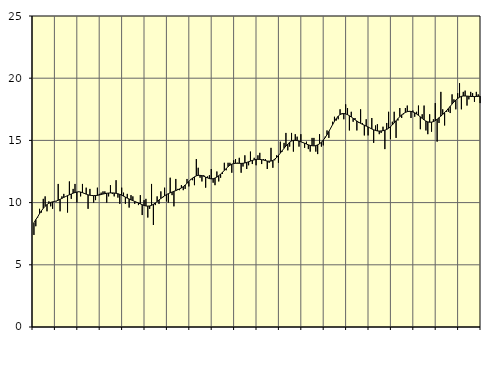
| Category | Piggar | Series 1 |
|---|---|---|
| nan | 7.4 | 8.38 |
| 1.0 | 8.1 | 8.63 |
| 1.0 | 8.8 | 8.85 |
| 1.0 | 9.5 | 9.11 |
| 1.0 | 9.2 | 9.34 |
| 1.0 | 10.3 | 9.54 |
| 1.0 | 10.5 | 9.71 |
| 1.0 | 9.3 | 9.84 |
| 1.0 | 10.1 | 9.95 |
| 1.0 | 9.7 | 10.02 |
| 1.0 | 9.5 | 10.06 |
| 1.0 | 10.1 | 10.09 |
| nan | 10.1 | 10.13 |
| 2.0 | 11.5 | 10.19 |
| 2.0 | 9.3 | 10.26 |
| 2.0 | 10.5 | 10.34 |
| 2.0 | 10.7 | 10.42 |
| 2.0 | 10.5 | 10.49 |
| 2.0 | 9.2 | 10.56 |
| 2.0 | 11.7 | 10.63 |
| 2.0 | 10.3 | 10.69 |
| 2.0 | 11.1 | 10.76 |
| 2.0 | 11.5 | 10.81 |
| 2.0 | 10 | 10.85 |
| nan | 10.9 | 10.87 |
| 3.0 | 10.5 | 10.85 |
| 3.0 | 11.5 | 10.8 |
| 3.0 | 10.7 | 10.74 |
| 3.0 | 11.2 | 10.68 |
| 3.0 | 9.5 | 10.62 |
| 3.0 | 11.1 | 10.59 |
| 3.0 | 10.6 | 10.57 |
| 3.0 | 10 | 10.56 |
| 3.0 | 10.2 | 10.57 |
| 3.0 | 11.2 | 10.58 |
| 3.0 | 10.7 | 10.61 |
| nan | 10.8 | 10.65 |
| 4.0 | 10.9 | 10.69 |
| 4.0 | 10.9 | 10.72 |
| 4.0 | 10 | 10.75 |
| 4.0 | 10.5 | 10.77 |
| 4.0 | 11.4 | 10.78 |
| 4.0 | 10.7 | 10.78 |
| 4.0 | 10.5 | 10.77 |
| 4.0 | 11.8 | 10.75 |
| 4.0 | 10.4 | 10.71 |
| 4.0 | 9.9 | 10.66 |
| 4.0 | 11.2 | 10.6 |
| nan | 10.8 | 10.52 |
| 5.0 | 9.9 | 10.44 |
| 5.0 | 10.7 | 10.36 |
| 5.0 | 9.6 | 10.29 |
| 5.0 | 10.6 | 10.22 |
| 5.0 | 10.5 | 10.16 |
| 5.0 | 9.9 | 10.09 |
| 5.0 | 10 | 10.03 |
| 5.0 | 9.8 | 9.97 |
| 5.0 | 10.6 | 9.9 |
| 5.0 | 9 | 9.83 |
| 5.0 | 10.2 | 9.77 |
| nan | 10.3 | 9.73 |
| 6.0 | 8.8 | 9.72 |
| 6.0 | 9.5 | 9.73 |
| 6.0 | 11.5 | 9.78 |
| 6.0 | 8.2 | 9.86 |
| 6.0 | 9.8 | 9.97 |
| 6.0 | 10.5 | 10.09 |
| 6.0 | 9.9 | 10.21 |
| 6.0 | 10.9 | 10.33 |
| 6.0 | 10.4 | 10.45 |
| 6.0 | 11.2 | 10.55 |
| 6.0 | 10.1 | 10.64 |
| nan | 10 | 10.72 |
| 7.0 | 12 | 10.79 |
| 7.0 | 10.6 | 10.85 |
| 7.0 | 9.7 | 10.91 |
| 7.0 | 11.9 | 10.96 |
| 7.0 | 11.1 | 11.03 |
| 7.0 | 11 | 11.1 |
| 7.0 | 11.4 | 11.18 |
| 7.0 | 11 | 11.28 |
| 7.0 | 11.1 | 11.41 |
| 7.0 | 11.9 | 11.55 |
| 7.0 | 11.3 | 11.7 |
| nan | 11.9 | 11.85 |
| 8.0 | 11.8 | 11.97 |
| 8.0 | 11.4 | 12.07 |
| 8.0 | 13.5 | 12.15 |
| 8.0 | 12.8 | 12.19 |
| 8.0 | 12 | 12.19 |
| 8.0 | 11.7 | 12.17 |
| 8.0 | 12.2 | 12.12 |
| 8.0 | 11.2 | 12.05 |
| 8.0 | 12.1 | 11.99 |
| 8.0 | 12.2 | 11.93 |
| 8.0 | 12.7 | 11.91 |
| nan | 11.6 | 11.92 |
| 9.0 | 11.4 | 11.97 |
| 9.0 | 12.5 | 12.05 |
| 9.0 | 11.7 | 12.16 |
| 9.0 | 12 | 12.29 |
| 9.0 | 12.3 | 12.43 |
| 9.0 | 13.2 | 12.59 |
| 9.0 | 12.6 | 12.74 |
| 9.0 | 13.2 | 12.89 |
| 9.0 | 13.2 | 13.01 |
| 9.0 | 12.4 | 13.09 |
| 9.0 | 13.4 | 13.14 |
| nan | 13.5 | 13.16 |
| 10.0 | 13.2 | 13.16 |
| 10.0 | 13.6 | 13.16 |
| 10.0 | 12.4 | 13.15 |
| 10.0 | 12.9 | 13.16 |
| 10.0 | 13.8 | 13.19 |
| 10.0 | 12.7 | 13.23 |
| 10.0 | 13 | 13.28 |
| 10.0 | 14.1 | 13.34 |
| 10.0 | 13.1 | 13.39 |
| 10.0 | 13.6 | 13.44 |
| 10.0 | 13 | 13.47 |
| nan | 13.8 | 13.48 |
| 11.0 | 14 | 13.47 |
| 11.0 | 13.1 | 13.45 |
| 11.0 | 13.5 | 13.42 |
| 11.0 | 13.5 | 13.38 |
| 11.0 | 12.7 | 13.34 |
| 11.0 | 13.2 | 13.33 |
| 11.0 | 14.4 | 13.34 |
| 11.0 | 12.8 | 13.39 |
| 11.0 | 13.4 | 13.49 |
| 11.0 | 13.8 | 13.62 |
| 11.0 | 13.2 | 13.79 |
| nan | 14.9 | 13.98 |
| 12.0 | 14.1 | 14.17 |
| 12.0 | 14.8 | 14.37 |
| 12.0 | 15.6 | 14.55 |
| 12.0 | 14.2 | 14.71 |
| 12.0 | 14.5 | 14.85 |
| 12.0 | 15.6 | 14.95 |
| 12.0 | 14.1 | 15 |
| 12.0 | 15.5 | 15.01 |
| 12.0 | 15.3 | 14.99 |
| 12.0 | 14.5 | 14.94 |
| 12.0 | 15.5 | 14.89 |
| nan | 14.8 | 14.83 |
| 13.0 | 14.4 | 14.77 |
| 13.0 | 14.9 | 14.71 |
| 13.0 | 14.3 | 14.64 |
| 13.0 | 14.1 | 14.6 |
| 13.0 | 15.2 | 14.57 |
| 13.0 | 15.2 | 14.56 |
| 13.0 | 14.1 | 14.58 |
| 13.0 | 13.9 | 14.64 |
| 13.0 | 15.5 | 14.73 |
| 13.0 | 14.5 | 14.85 |
| 13.0 | 14.6 | 15.02 |
| nan | 15.3 | 15.22 |
| 14.0 | 15.8 | 15.46 |
| 14.0 | 15.2 | 15.72 |
| 14.0 | 16 | 15.99 |
| 14.0 | 16.5 | 16.27 |
| 14.0 | 16.9 | 16.53 |
| 14.0 | 16.6 | 16.76 |
| 14.0 | 16.7 | 16.95 |
| 14.0 | 17.5 | 17.08 |
| 14.0 | 17.1 | 17.15 |
| 14.0 | 16.7 | 17.16 |
| 14.0 | 17.9 | 17.13 |
| nan | 17.6 | 17.07 |
| 15.0 | 15.8 | 16.98 |
| 15.0 | 17.3 | 16.88 |
| 15.0 | 16.5 | 16.77 |
| 15.0 | 16.8 | 16.66 |
| 15.0 | 15.8 | 16.56 |
| 15.0 | 16.4 | 16.46 |
| 15.0 | 17.5 | 16.37 |
| 15.0 | 16.4 | 16.29 |
| 15.0 | 15.4 | 16.22 |
| 15.0 | 16.7 | 16.15 |
| 15.0 | 15.4 | 16.08 |
| nan | 16 | 16 |
| 16.0 | 16.8 | 15.92 |
| 16.0 | 14.8 | 15.85 |
| 16.0 | 16.2 | 15.8 |
| 16.0 | 16.3 | 15.76 |
| 16.0 | 15.5 | 15.75 |
| 16.0 | 15.6 | 15.76 |
| 16.0 | 16.1 | 15.78 |
| 16.0 | 14.3 | 15.82 |
| 16.0 | 16.4 | 15.88 |
| 16.0 | 17.3 | 15.98 |
| 16.0 | 15.1 | 16.1 |
| nan | 16.5 | 16.24 |
| 17.0 | 17.3 | 16.41 |
| 17.0 | 15.2 | 16.58 |
| 17.0 | 16.6 | 16.75 |
| 17.0 | 17.6 | 16.91 |
| 17.0 | 16.8 | 17.05 |
| 17.0 | 17.1 | 17.16 |
| 17.0 | 17.6 | 17.25 |
| 17.0 | 17.8 | 17.31 |
| 17.0 | 17.3 | 17.34 |
| 17.0 | 16.8 | 17.33 |
| 17.0 | 17.4 | 17.29 |
| nan | 16.9 | 17.22 |
| 18.0 | 17.3 | 17.12 |
| 18.0 | 17.8 | 17.01 |
| 18.0 | 15.9 | 16.89 |
| 18.0 | 17.1 | 16.77 |
| 18.0 | 17.8 | 16.65 |
| 18.0 | 15.8 | 16.55 |
| 18.0 | 15.5 | 16.49 |
| 18.0 | 17.1 | 16.46 |
| 18.0 | 15.7 | 16.47 |
| 18.0 | 16.7 | 16.51 |
| 18.0 | 18 | 16.59 |
| nan | 14.9 | 16.7 |
| 19.0 | 16.4 | 16.82 |
| 19.0 | 18.9 | 16.95 |
| 19.0 | 17.5 | 17.09 |
| 19.0 | 16.2 | 17.24 |
| 19.0 | 17.3 | 17.39 |
| 19.0 | 17.3 | 17.56 |
| 19.0 | 17.2 | 17.74 |
| 19.0 | 18.7 | 17.92 |
| 19.0 | 18.3 | 18.09 |
| 19.0 | 17.5 | 18.25 |
| 19.0 | 18.8 | 18.37 |
| nan | 19.6 | 18.47 |
| 20.0 | 17.5 | 18.54 |
| 20.0 | 18.9 | 18.57 |
| 20.0 | 19 | 18.57 |
| 20.0 | 17.8 | 18.56 |
| 20.0 | 18.3 | 18.55 |
| 20.0 | 18.9 | 18.53 |
| 20.0 | 18.8 | 18.53 |
| 20.0 | 18.1 | 18.52 |
| 20.0 | 18.9 | 18.53 |
| 20.0 | 18.7 | 18.54 |
| 20.0 | 18 | 18.56 |